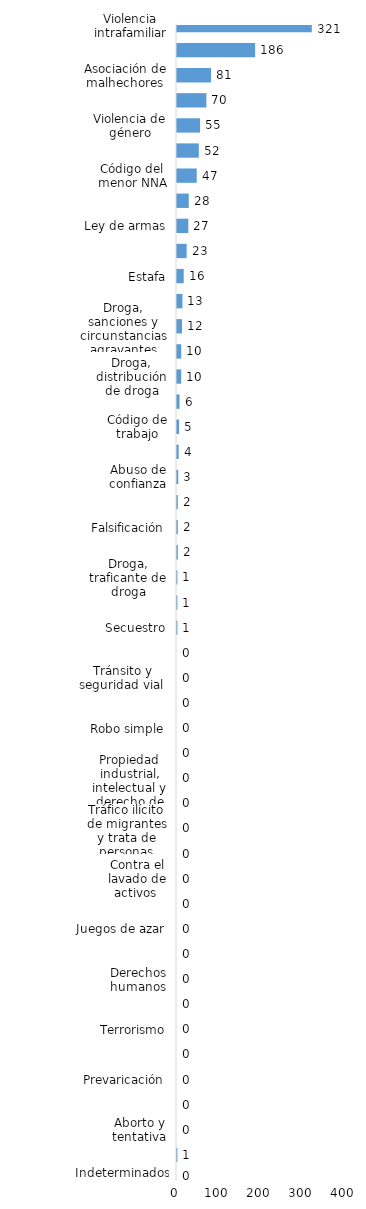
| Category | Series 0 |
|---|---|
| Violencia intrafamiliar | 321 |
| Robo calificado | 186 |
| Asociación de malhechores | 81 |
| Amenaza | 70 |
| Violencia de género | 55 |
| Golpes y heridas | 52 |
| Código del menor NNA | 47 |
| Violación sexual | 28 |
| Ley de armas | 27 |
| Droga, simple posesión | 23 |
| Estafa | 16 |
| Agresión sexual | 13 |
| Droga, sanciones y circunstancias agravantes | 12 |
| Daños y perjuicios a la cosa ajena | 10 |
| Droga, distribución de droga | 10 |
| Homicidio | 6 |
| Código de trabajo | 5 |
| Crímenes y delitos de alta tecnología | 4 |
| Abuso de confianza | 3 |
| Protección animal y tenencia responsable | 2 |
| Falsificación | 2 |
| Crímenes y delitos contra la propiedad | 2 |
| Droga, traficante de droga | 1 |
| Tentativa de homicidio | 1 |
| Secuestro | 1 |
| Pérdida de documento de identidad | 0 |
| Tránsito y seguridad vial  | 0 |
| Desaparición | 0 |
| Robo simple | 0 |
| Difamación e injuria | 0 |
| Propiedad industrial, intelectual y derecho de autor | 0 |
| Conflictos sociales | 0 |
| Tráfico ilícito de migrantes y trata de personas | 0 |
| Medio ambiente y recursos naturales | 0 |
| Contra el lavado de activos  | 0 |
| Ley general de salud | 0 |
| Juegos de azar | 0 |
| Ley de cheques | 0 |
| Derechos humanos | 0 |
| Proxenetismo | 0 |
| Terrorismo | 0 |
| Soborno | 0 |
| Prevaricación | 0 |
| Droga, delitos y sanciones | 0 |
| Aborto y tentativa | 0 |
| Otros | 1 |
| Indeterminados | 0 |